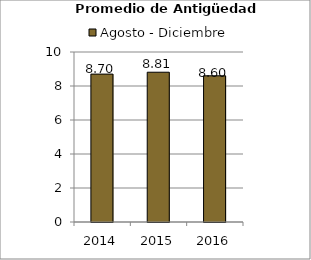
| Category | Agosto - Diciembre |
|---|---|
| 2014.0 | 8.7 |
| 2015.0 | 8.81 |
| 2016.0 | 8.6 |